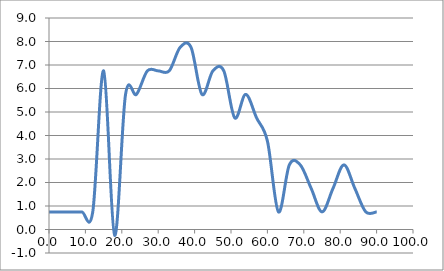
| Category | Elevation (in.) |
|---|---|
| 0.024 | 0.75 |
| 3.024 | 0.75 |
| 6.024 | 0.75 |
| 9.024000000000001 | 0.75 |
| 12.024000000000001 | 0.75 |
| 15.024000000000001 | 6.75 |
| 18.024 | -0.25 |
| 21.024 | 5.75 |
| 24.023999999999997 | 5.75 |
| 27.023999999999997 | 6.75 |
| 30.023999999999997 | 6.75 |
| 33.024 | 6.75 |
| 36.024 | 7.75 |
| 39.024 | 7.75 |
| 42.024 | 5.75 |
| 45.024 | 6.75 |
| 48.024 | 6.75 |
| 51.024 | 4.75 |
| 54.024 | 5.75 |
| 57.024 | 4.75 |
| 60.024 | 3.75 |
| 63.024 | 0.75 |
| 66.024 | 2.75 |
| 69.024 | 2.75 |
| 72.024 | 1.75 |
| 75.024 | 0.75 |
| 78.024 | 1.75 |
| 81.024 | 2.75 |
| 84.024 | 1.75 |
| 87.024 | 0.75 |
| 90.024 | 0.75 |